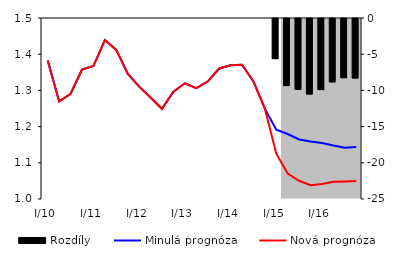
| Category | Rozdíly |
|---|---|
| 0 | 0 |
| 1 | 0 |
| 2 | 0 |
| 3 | 0 |
| 4 | 0 |
| 5 | 0 |
| 6 | 0 |
| 7 | 0 |
| 8 | 0 |
| 9 | 0 |
| 10 | 0 |
| 11 | 0 |
| 12 | 0 |
| 13 | 0 |
| 14 | 0 |
| 15 | 0 |
| 16 | 0 |
| 17 | 0 |
| 18 | 0 |
| 19 | 0 |
| 20 | -5.541 |
| 21 | -9.266 |
| 22 | -9.789 |
| 23 | -10.424 |
| 24 | -9.817 |
| 25 | -8.747 |
| 26 | -8.174 |
| 27 | -8.219 |